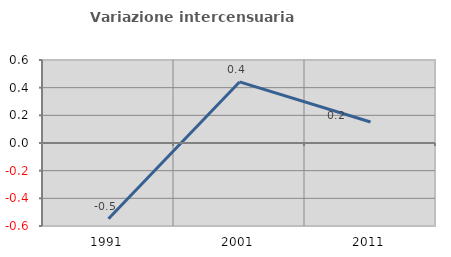
| Category | Variazione intercensuaria annua |
|---|---|
| 1991.0 | -0.548 |
| 2001.0 | 0.442 |
| 2011.0 | 0.152 |